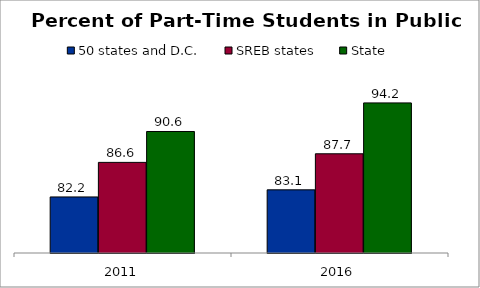
| Category | 50 states and D.C. | SREB states | State |
|---|---|---|---|
| 2011 | 82.186 | 86.617 | 90.577 |
| 2016 | 83.097 | 87.718 | 94.242 |